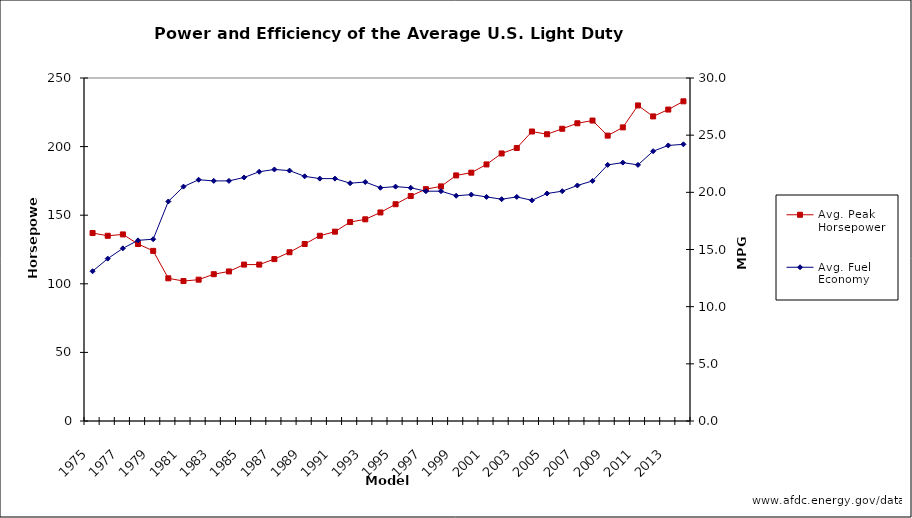
| Category | Avg. Peak Horsepower |
|---|---|
| 1975 | 137 |
| 1976 | 135 |
| 1977 | 136 |
| 1978 | 129 |
| 1979 | 124 |
| 1980 | 104 |
| 1981 | 102 |
| 1982 | 103 |
| 1983 | 107 |
| 1984 | 109 |
| 1985 | 114 |
| 1986 | 114 |
| 1987 | 118 |
| 1988 | 123 |
| 1989 | 129 |
| 1990 | 135 |
| 1991 | 138 |
| 1992 | 145 |
| 1993 | 147 |
| 1994 | 152 |
| 1995 | 158 |
| 1996 | 164 |
| 1997 | 169 |
| 1998 | 171 |
| 1999 | 179 |
| 2000 | 181 |
| 2001 | 187 |
| 2002 | 195 |
| 2003 | 199 |
| 2004 | 211 |
| 2005 | 209 |
| 2006 | 213 |
| 2007 | 217 |
| 2008 | 219 |
| 2009 | 208 |
| 2010 | 214 |
| 2011 | 230 |
| 2012 | 222 |
| 2013 | 227 |
| 2014 (P) | 233 |